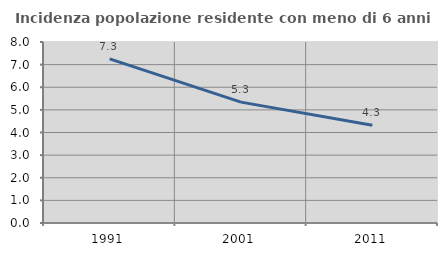
| Category | Incidenza popolazione residente con meno di 6 anni |
|---|---|
| 1991.0 | 7.251 |
| 2001.0 | 5.343 |
| 2011.0 | 4.317 |